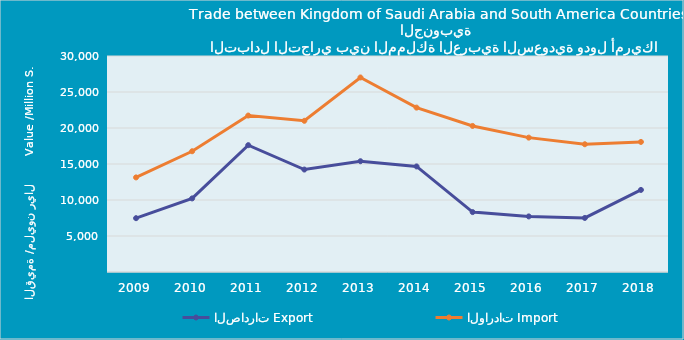
| Category | الصادرات | الواردات |
|---|---|---|
| 2009.0 | 7475730359 | 13137200907 |
| 2010.0 | 10221172538 | 16772396767 |
| 2011.0 | 17616286102 | 21729531433 |
| 2012.0 | 14228381136 | 20999857788 |
| 2013.0 | 15384831294 | 27018066833 |
| 2014.0 | 14661582763 | 22832014822 |
| 2015.0 | 8318863702 | 20285686225 |
| 2016.0 | 7719081816 | 18662037443 |
| 2017.0 | 7508812993 | 17744100902 |
| 2018.0 | 11400423436 | 18065465632 |